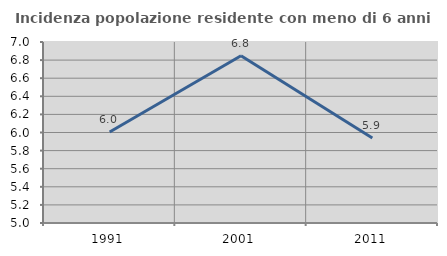
| Category | Incidenza popolazione residente con meno di 6 anni |
|---|---|
| 1991.0 | 6.006 |
| 2001.0 | 6.847 |
| 2011.0 | 5.938 |